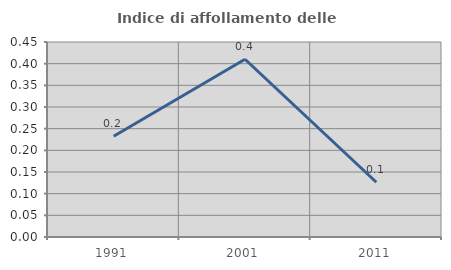
| Category | Indice di affollamento delle abitazioni  |
|---|---|
| 1991.0 | 0.233 |
| 2001.0 | 0.41 |
| 2011.0 | 0.126 |